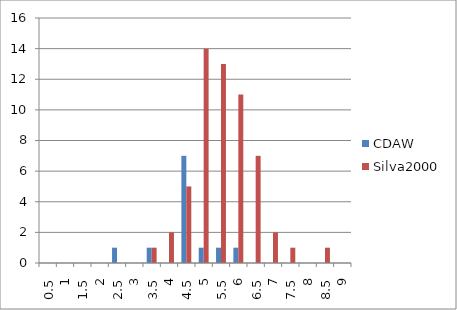
| Category | CDAW | Silva2000 |
|---|---|---|
| 0.5 | 0 | 0 |
| 1.0 | 0 | 0 |
| 1.5 | 0 | 0 |
| 2.0 | 0 | 0 |
| 2.5 | 1 | 0 |
| 3.0 | 0 | 0 |
| 3.5 | 1 | 1 |
| 4.0 | 0 | 2 |
| 4.5 | 7 | 5 |
| 5.0 | 1 | 14 |
| 5.5 | 1 | 13 |
| 6.0 | 1 | 11 |
| 6.5 | 0 | 7 |
| 7.0 | 0 | 2 |
| 7.5 | 0 | 1 |
| 8.0 | 0 | 0 |
| 8.5 | 0 | 1 |
| 9.0 | 0 | 0 |